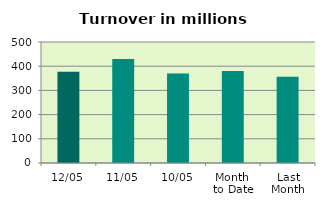
| Category | Series 0 |
|---|---|
| 12/05 | 377.084 |
| 11/05 | 430.26 |
| 10/05 | 369.688 |
| Month 
to Date | 379.809 |
| Last
Month | 356.105 |